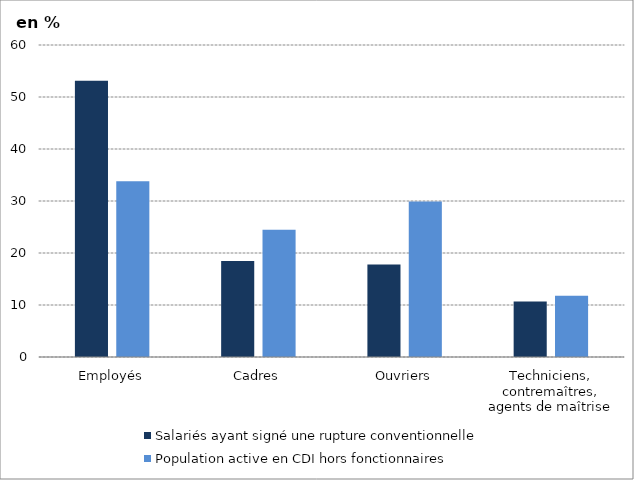
| Category | Salariés ayant signé une rupture conventionnelle | Population active en CDI hors fonctionnaires |
|---|---|---|
| Employés | 53.116 | 33.8 |
| Cadres | 18.445 | 24.47 |
| Ouvriers | 17.779 | 29.9 |
| Techniciens, contremaîtres, agents de maîtrise | 10.659 | 11.8 |